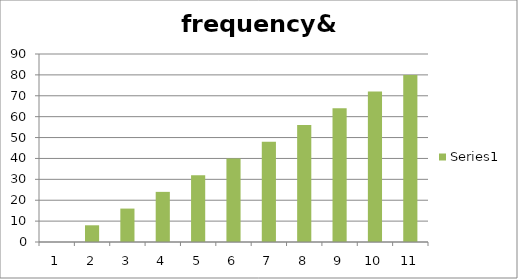
| Category | Series 0 |
|---|---|
| 0 | 0 |
| 1 | 8 |
| 2 | 16 |
| 3 | 24 |
| 4 | 32 |
| 5 | 40 |
| 6 | 48 |
| 7 | 56 |
| 8 | 64 |
| 9 | 72 |
| 10 | 80 |